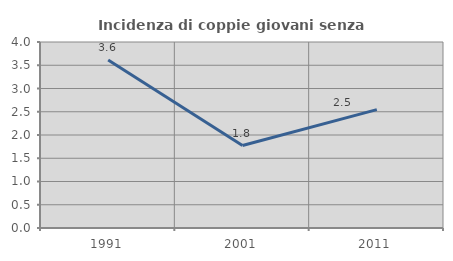
| Category | Incidenza di coppie giovani senza figli |
|---|---|
| 1991.0 | 3.614 |
| 2001.0 | 1.773 |
| 2011.0 | 2.545 |